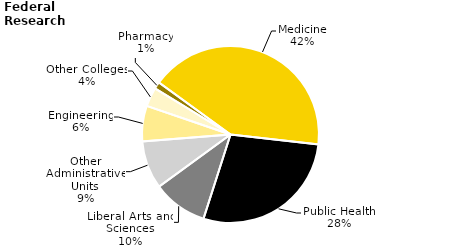
| Category | Series 0 |
|---|---|
| Medicine | 153.08 |
| Public Health | 103.128 |
| Liberal Arts and Sciences | 36.73 |
| Other Administrative Units | 32.211 |
| Engineering | 23.725 |
| Other Colleges | 12.79 |
| Pharmacy | 4.674 |